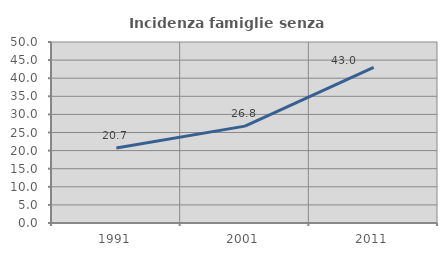
| Category | Incidenza famiglie senza nuclei |
|---|---|
| 1991.0 | 20.706 |
| 2001.0 | 26.764 |
| 2011.0 | 43.019 |